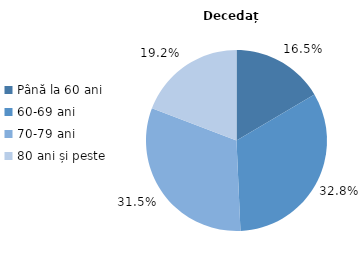
| Category | Decedați |
|---|---|
| Până la 60 ani | 16.5 |
| 60-69 ani | 32.8 |
| 70-79 ani | 31.5 |
| 80 ani și peste | 19.2 |